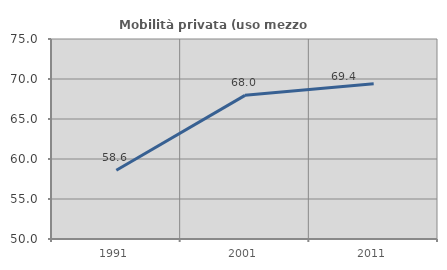
| Category | Mobilità privata (uso mezzo privato) |
|---|---|
| 1991.0 | 58.585 |
| 2001.0 | 67.957 |
| 2011.0 | 69.403 |